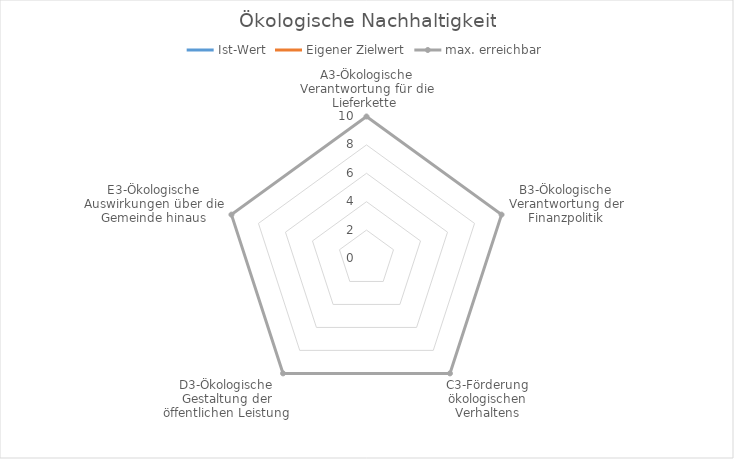
| Category | Ist-Wert | Eigener Zielwert | max. erreichbar |
|---|---|---|---|
| A3-Ökologische Verantwortung für die Lieferkette  | 0 | 0 | 10 |
| B3-Ökologische Verantwortung der Finanzpolitik | 0 | 0 | 10 |
| C3-Förderung ökologischen Verhaltens | 0 | 0 | 10 |
| D3-Ökologische Gestaltung der öffentlichen Leistung | 0 | 0 | 10 |
| E3-Ökologische Auswirkungen über die Gemeinde hinaus | 0 | 0 | 10 |